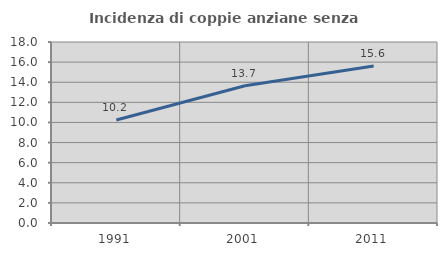
| Category | Incidenza di coppie anziane senza figli  |
|---|---|
| 1991.0 | 10.247 |
| 2001.0 | 13.656 |
| 2011.0 | 15.614 |